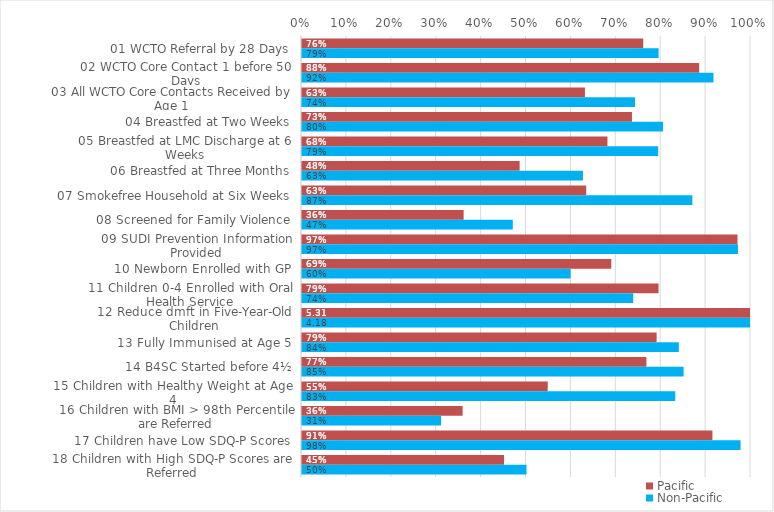
| Category | Pacific | Non-Pacific |
|---|---|---|
| 01 WCTO Referral by 28 Days | 0.76 | 0.794 |
| 02 WCTO Core Contact 1 before 50 Days | 0.885 | 0.916 |
| 03 All WCTO Core Contacts Received by Age 1 | 0.63 | 0.742 |
| 04 Breastfed at Two Weeks | 0.735 | 0.804 |
| 05 Breastfed at LMC Discharge at 6 Weeks | 0.68 | 0.793 |
| 06 Breastfed at Three Months | 0.485 | 0.626 |
| 07 Smokefree Household at Six Weeks | 0.633 | 0.869 |
| 08 Screened for Family Violence | 0.36 | 0.469 |
| 09 SUDI Prevention Information Provided | 0.97 | 0.971 |
| 10 Newborn Enrolled with GP | 0.689 | 0.598 |
| 11 Children 0-4 Enrolled with Oral Health Service | 0.794 | 0.738 |
| 12 Reduce dmft in Five-Year-Old Children | 5.311 | 4.185 |
| 13 Fully Immunised at Age 5 | 0.79 | 0.839 |
| 14 B4SC Started before 4½ | 0.767 | 0.85 |
| 15 Children with Healthy Weight at Age 4 | 0.547 | 0.831 |
| 16 Children with BMI > 98th Percentile are Referred | 0.358 | 0.31 |
| 17 Children have Low SDQ-P Scores | 0.914 | 0.977 |
| 18 Children with High SDQ-P Scores are Referred | 0.45 | 0.5 |